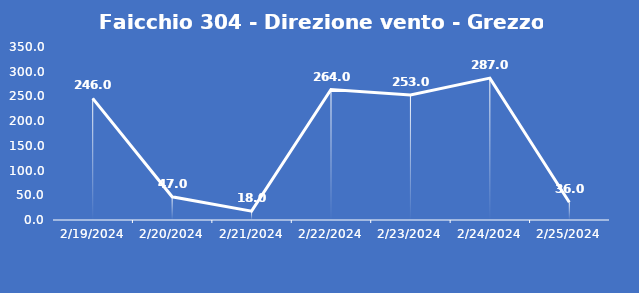
| Category | Faicchio 304 - Direzione vento - Grezzo (°N) |
|---|---|
| 2/19/24 | 246 |
| 2/20/24 | 47 |
| 2/21/24 | 18 |
| 2/22/24 | 264 |
| 2/23/24 | 253 |
| 2/24/24 | 287 |
| 2/25/24 | 36 |